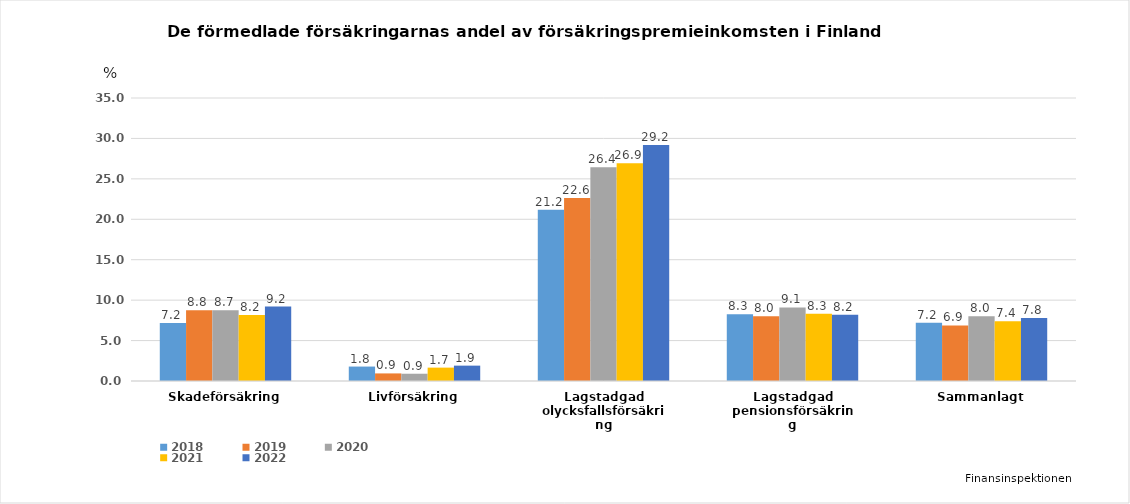
| Category | 2018 | 2019 | 2020 | 2021 | 2022 |
|---|---|---|---|---|---|
| Skadeförsäkring | 7.184 | 8.751 | 8.75 | 8.151 | 9.2 |
| Livförsäkring | 1.786 | 0.938 | 0.899 | 1.654 | 1.9 |
| Lagstadgad olycksfallsförsäkring | 21.186 | 22.632 | 26.436 | 26.92 | 29.2 |
| Lagstadgad pensionsförsäkring | 8.268 | 8.015 | 9.101 | 8.331 | 8.2 |
| Sammanlagt | 7.208 | 6.878 | 8 | 7.377 | 7.8 |